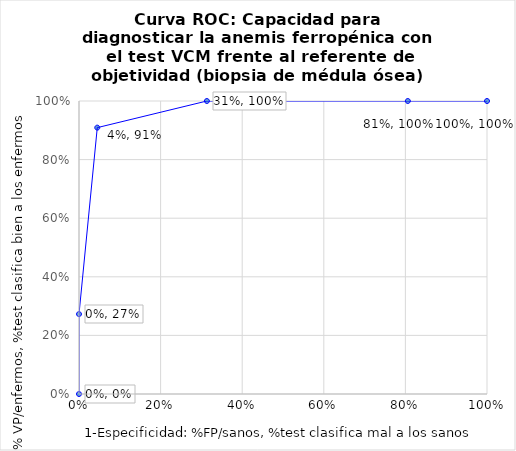
| Category | Sensibilidad |
|---|---|
| 1.0 | 1 |
| 0.8059701492537313 | 1 |
| 0.31343283582089554 | 1 |
| 0.04477611940298509 | 0.909 |
| 0.0 | 0.273 |
| 0.0 | 0 |